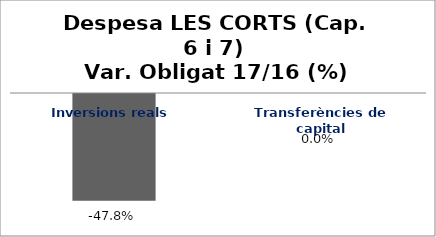
| Category | Series 0 |
|---|---|
| Inversions reals | -0.478 |
| Transferències de capital | 0 |